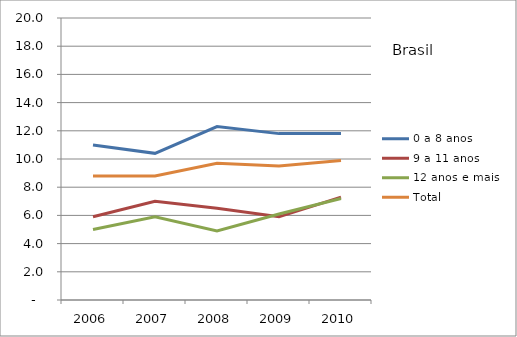
| Category | 0 a 8 anos | 9 a 11 anos | 12 anos e mais | Total |
|---|---|---|---|---|
| 2006.0 | 11 | 5.9 | 5 | 8.8 |
| 2007.0 | 10.4 | 7 | 5.9 | 8.8 |
| 2008.0 | 12.3 | 6.5 | 4.9 | 9.7 |
| 2009.0 | 11.8 | 5.9 | 6.1 | 9.5 |
| 2010.0 | 11.8 | 7.3 | 7.2 | 9.9 |